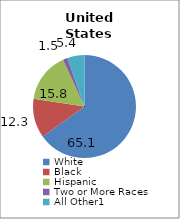
| Category | 50 states and D.C. |
|---|---|
| White | 65.097 |
| Black | 12.274 |
| Hispanic | 15.771 |
| Two or More Races | 1.485 |
| All Other1 | 5.373 |